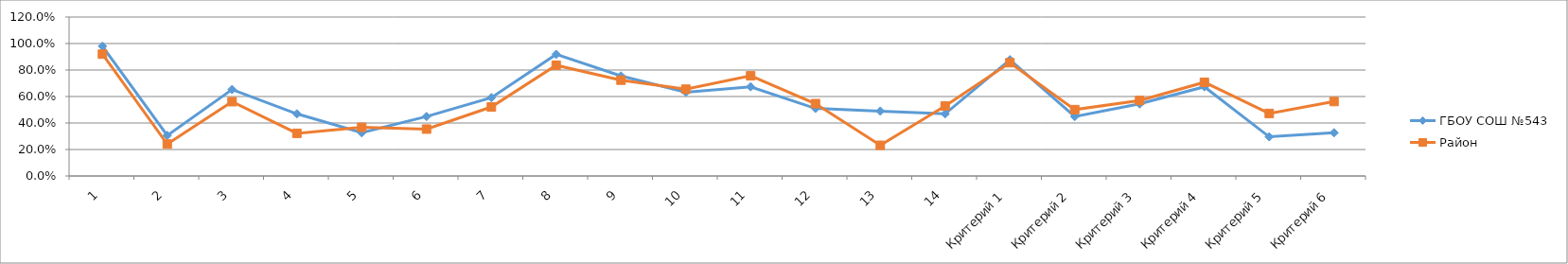
| Category | ГБОУ СОШ №543 | Район |
|---|---|---|
| 1 | 0.98 | 0.92 |
| 2 | 0.306 | 0.241 |
| 3 | 0.653 | 0.561 |
| 4 | 0.469 | 0.322 |
| 5 | 0.327 | 0.368 |
| 6 | 0.449 | 0.354 |
| 7 | 0.592 | 0.521 |
| 8 | 0.918 | 0.836 |
| 9 | 0.755 | 0.723 |
| 10 | 0.633 | 0.655 |
| 11 | 0.673 | 0.756 |
| 12 | 0.51 | 0.546 |
| 13 | 0.49 | 0.232 |
| 14 | 0.469 | 0.529 |
| Критерий 1 | 0.878 | 0.855 |
| Критерий 2 | 0.449 | 0.501 |
| Критерий 3 | 0.544 | 0.57 |
| Критерий 4 | 0.673 | 0.707 |
| Критерий 5 | 0.296 | 0.472 |
| Критерий 6 | 0.327 | 0.562 |